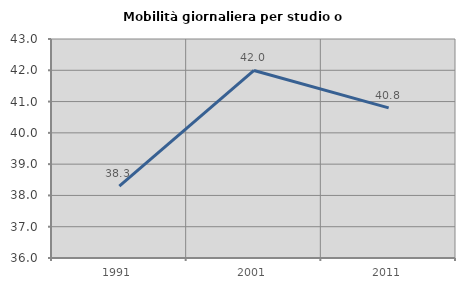
| Category | Mobilità giornaliera per studio o lavoro |
|---|---|
| 1991.0 | 38.297 |
| 2001.0 | 41.995 |
| 2011.0 | 40.798 |